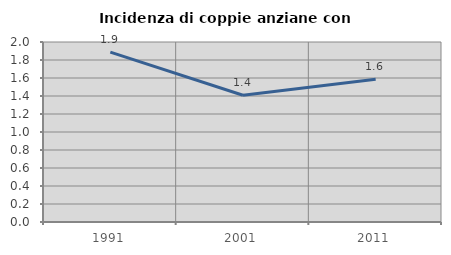
| Category | Incidenza di coppie anziane con figli |
|---|---|
| 1991.0 | 1.887 |
| 2001.0 | 1.408 |
| 2011.0 | 1.587 |